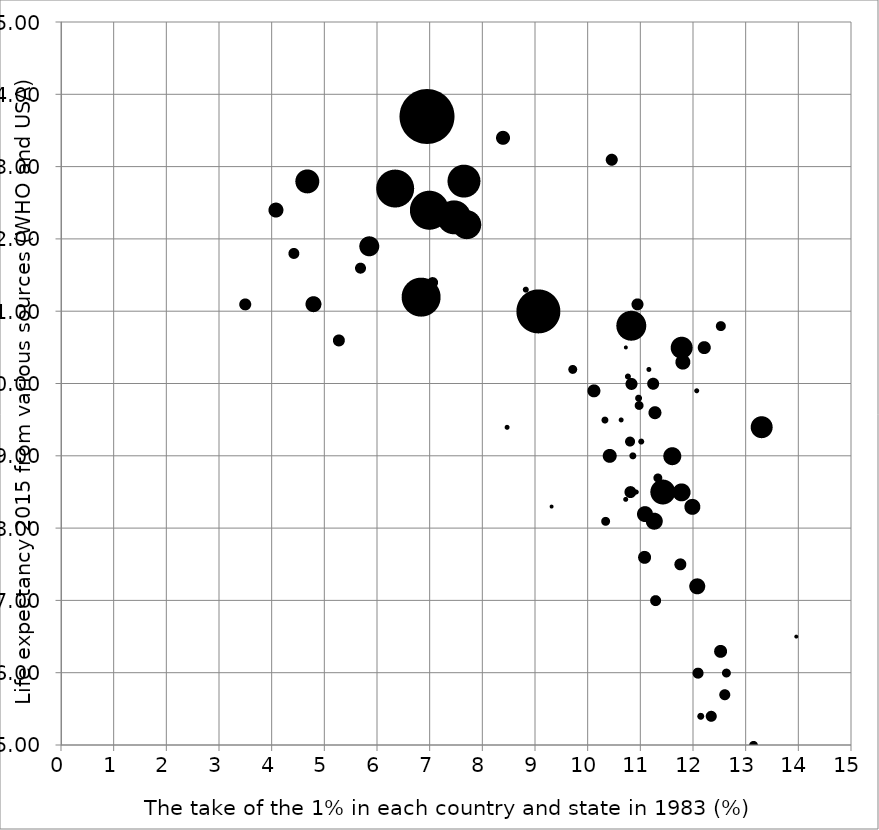
| Category | Series 0 |
|---|---|
| 12.342149 | 75.4 |
| 8.4618807 | 79.4 |
| 11.272208 | 79.6 |
| 12.627508 | 76 |
| 10.827101 | 80.8 |
| 10.823525 | 80 |
| 12.519849 | 80.8 |
| 10.718918 | 78.4 |
| 13.960412 | 76.5 |
| 13.298127 | 79.4 |
| 12.073452 | 77.2 |
| 8.8225587 | 81.3 |
| 10.319641 | 79.5 |
| 11.599077 | 79 |
| 11.073858 | 77.6 |
| 10.971814 | 79.7 |
| 11.324685 | 78.7 |
| 12.086685 | 76 |
| 12.596983 | 75.7 |
| 11.013192 | 79.2 |
| 10.809328 | 78.5 |
| 12.208504 | 80.5 |
| 11.079764 | 78.2 |
| 10.938519 | 81.1 |
| 13.142256 | 75 |
| 11.757833 | 77.5 |
| 10.921436 | 78.5 |
| 10.963338 | 79.8 |
| 10.332483 | 78.1 |
| 10.759662 | 80.1 |
| 11.801322 | 80.3 |
| 10.857477 | 79 |
| 11.7783 | 80.5 |
| 11.979431 | 78.3 |
| 11.154256 | 80.2 |
| 11.258063 | 78.1 |
| 12.09054 | 76 |
| 10.800268 | 79.2 |
| 11.774806 | 78.5 |
| 12.069936 | 79.9 |
| 11.285991 | 77 |
| 10.630249 | 79.5 |
| 12.516923 | 76.3 |
| 11.42572 | 78.5 |
| 9.7092366 | 80.2 |
| 10.723032 | 80.5 |
| 10.41725 | 79 |
| 10.116898 | 79.9 |
| 12.142691 | 75.4 |
| 11.23925 | 80 |
| 9.311722 | 78.3 |
| 4.67 | 82.8 |
| 7.7 | 82.2 |
| 5.27 | 80.6 |
| 3.49 | 81.1 |
| 6.99 | 82.4 |
| 9.06 | 81 |
| 7.05 | 81.4 |
| 6.34 | 82.7 |
| 6.94 | 83.7 |
| 7.46 | 82.3 |
| 5.85 | 81.9 |
| 5.68 | 81.6 |
| 4.42 | 81.8 |
| 4.79 | 81.1 |
| 10.45 | 83.1 |
| 7.65 | 82.8 |
| 4.08 | 82.4 |
| 8.39 | 83.4 |
| 6.83 | 81.2 |